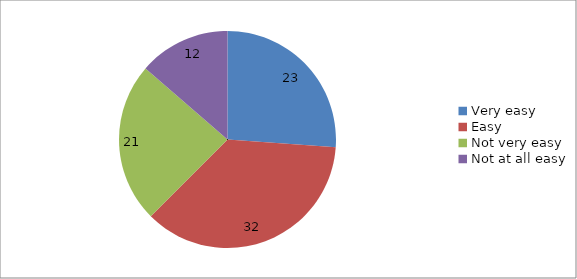
| Category | Series 0 |
|---|---|
| Very easy | 23 |
| Easy | 32 |
| Not very easy | 21 |
| Not at all easy | 12 |